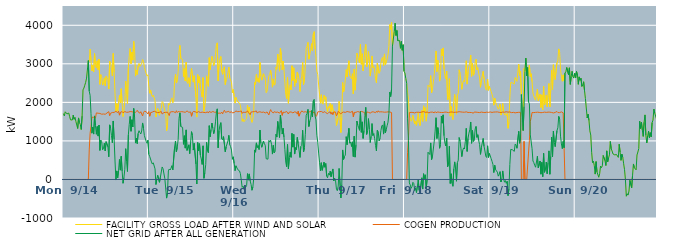
| Category | FACILITY GROSS LOAD AFTER WIND AND SOLAR | COGEN PRODUCTION | NET GRID AFTER ALL GENERATION |
|---|---|---|---|
|  Mon  9/14 | 1708 | 0 | 1708 |
|  Mon  9/14 | 1648 | 0 | 1648 |
|  Mon  9/14 | 1755 | 0 | 1755 |
|  Mon  9/14 | 1758 | 0 | 1758 |
|  Mon  9/14 | 1700 | 0 | 1700 |
|  Mon  9/14 | 1678 | 0 | 1678 |
|  Mon  9/14 | 1722 | 0 | 1722 |
|  Mon  9/14 | 1629 | 0 | 1629 |
|  Mon  9/14 | 1546 | 0 | 1546 |
|  Mon  9/14 | 1526 | 0 | 1526 |
|  Mon  9/14 | 1543 | 0 | 1543 |
|  Mon  9/14 | 1670 | 0 | 1670 |
|  Mon  9/14 | 1560 | 0 | 1560 |
|  Mon  9/14 | 1612 | 0 | 1612 |
|  Mon  9/14 | 1504 | 0 | 1504 |
|  Mon  9/14 | 1506 | 0 | 1506 |
|  Mon  9/14 | 1323 | 0 | 1323 |
|  Mon  9/14 | 1596 | 0 | 1596 |
|  Mon  9/14 | 1475 | 0 | 1475 |
|  Mon  9/14 | 1426 | 0 | 1426 |
|  Mon  9/14 | 1296 | 0 | 1296 |
|  Mon  9/14 | 1643 | 0 | 1643 |
|  Mon  9/14 | 2324 | 0 | 2324 |
|  Mon  9/14 | 2370 | 0 | 2370 |
|  Mon  9/14 | 2444 | 0 | 2444 |
|  Mon  9/14 | 2520 | 0 | 2520 |
|  Mon  9/14 | 2630 | 0 | 2630 |
|  Mon  9/14 | 2622 | 0 | 2622 |
|  Mon  9/14 | 3085 | 0 | 3085 |
|  Mon  9/14 | 3057 | 765 | 2292 |
|  Mon  9/14 | 3379 | 1198 | 2181 |
|  Mon  9/14 | 3082 | 1374 | 1708 |
|  Mon  9/14 | 2815 | 1615 | 1200 |
|  Mon  9/14 | 2960 | 1601 | 1359 |
|  Mon  9/14 | 2789 | 1612 | 1177 |
|  Mon  9/14 | 3266 | 1618 | 1648 |
|  Mon  9/14 | 2987 | 1591 | 1396 |
|  Mon  9/14 | 2899 | 1727 | 1172 |
|  Mon  9/14 | 3079 | 1705 | 1374 |
|  Mon  9/14 | 2843 | 1718 | 1125 |
|  Mon  9/14 | 3125 | 1714 | 1411 |
|  Mon  9/14 | 2467 | 1713 | 754 |
|  Mon  9/14 | 2721 | 1700 | 1021 |
|  Mon  9/14 | 2673 | 1693 | 980 |
|  Mon  9/14 | 2448 | 1678 | 770 |
|  Mon  9/14 | 2494 | 1698 | 796 |
|  Mon  9/14 | 2636 | 1697 | 939 |
|  Mon  9/14 | 2431 | 1692 | 739 |
|  Mon  9/14 | 2679 | 1699 | 980 |
|  Mon  9/14 | 2685 | 1725 | 960 |
|  Mon  9/14 | 2589 | 1742 | 847 |
|  Mon  9/14 | 2347 | 1759 | 588 |
|  Mon  9/14 | 3069 | 1653 | 1416 |
|  Mon  9/14 | 3043 | 1717 | 1326 |
|  Mon  9/14 | 2835 | 1694 | 1141 |
|  Mon  9/14 | 2688 | 1737 | 951 |
|  Mon  9/14 | 3269 | 1752 | 1517 |
|  Mon  9/14 | 2779 | 1740 | 1039 |
|  Mon  9/14 | 2227 | 1749 | 478 |
|  Mon  9/14 | 1752 | 1767 | -15 |
|  Mon  9/14 | 1965 | 1743 | 222 |
|  Mon  9/14 | 1774 | 1735 | 39 |
|  Mon  9/14 | 2002 | 1772 | 230 |
|  Mon  9/14 | 2186 | 1668 | 518 |
|  Mon  9/14 | 1984 | 1742 | 242 |
|  Mon  9/14 | 2354 | 1753 | 601 |
|  Mon  9/14 | 1978 | 1760 | 218 |
|  Mon  9/14 | 1632 | 1731 | -99 |
|  Mon  9/14 | 1783 | 1734 | 49 |
|  Mon  9/14 | 2023 | 1761 | 262 |
|  Mon  9/14 | 2551 | 1753 | 798 |
|  Mon  9/14 | 2209 | 1742 | 467 |
|  Mon  9/14 | 1967 | 1760 | 207 |
|  Mon  9/14 | 2902 | 1746 | 1156 |
|  Mon  9/14 | 3194 | 1766 | 1428 |
|  Mon  9/14 | 3397 | 1762 | 1635 |
|  Mon  9/14 | 3003 | 1753 | 1250 |
|  Mon  9/14 | 3306 | 1757 | 1549 |
|  Mon  9/14 | 3096 | 1734 | 1362 |
|  Mon  9/14 | 3584 | 1742 | 1842 |
|  Mon  9/14 | 3366 | 1763 | 1603 |
|  Mon  9/14 | 2681 | 1738 | 943 |
|  Mon  9/14 | 2839 | 1766 | 1073 |
|  Mon  9/14 | 2723 | 1794 | 929 |
|  Mon  9/14 | 2945 | 1752 | 1193 |
|  Mon  9/14 | 3012 | 1747 | 1265 |
|  Mon  9/14 | 2933 | 1720 | 1213 |
|  Mon  9/14 | 2938 | 1758 | 1180 |
|  Mon  9/14 | 3011 | 1754 | 1257 |
|  Mon  9/14 | 3113 | 1647 | 1466 |
|  Mon  9/14 | 3062 | 1734 | 1328 |
|  Mon  9/14 | 2908 | 1769 | 1139 |
|  Mon  9/14 | 2885 | 1750 | 1135 |
|  Mon  9/14 | 2748 | 1758 | 990 |
|  Mon  9/14 | 2685 | 1745 | 940 |
|  Mon  9/14 | 2718 | 1699 | 1019 |
|  Tue  9/15 | 2416 | 1761 | 655 |
|  Tue  9/15 | 2237 | 1640 | 597 |
|  Tue  9/15 | 2322 | 1731 | 591 |
|  Tue  9/15 | 2206 | 1751 | 455 |
|  Tue  9/15 | 2147 | 1748 | 399 |
|  Tue  9/15 | 2190 | 1758 | 432 |
|  Tue  9/15 | 2185 | 1772 | 413 |
|  Tue  9/15 | 2046 | 1772 | 274 |
|  Tue  9/15 | 1619 | 1750 | -131 |
|  Tue  9/15 | 1743 | 1733 | 10 |
|  Tue  9/15 | 1841 | 1732 | 109 |
|  Tue  9/15 | 1838 | 1717 | 121 |
|  Tue  9/15 | 1668 | 1741 | -73 |
|  Tue  9/15 | 1808 | 1751 | 57 |
|  Tue  9/15 | 1844 | 1764 | 80 |
|  Tue  9/15 | 2022 | 1698 | 324 |
|  Tue  9/15 | 1995 | 1716 | 279 |
|  Tue  9/15 | 2000 | 1735 | 265 |
|  Tue  9/15 | 1773 | 1749 | 24 |
|  Tue  9/15 | 1746 | 1740 | 6 |
|  Tue  9/15 | 1259 | 1743 | -484 |
|  Tue  9/15 | 1400 | 1747 | -347 |
|  Tue  9/15 | 1972 | 1751 | 221 |
|  Tue  9/15 | 1929 | 1657 | 272 |
|  Tue  9/15 | 1994 | 1748 | 246 |
|  Tue  9/15 | 2063 | 1770 | 293 |
|  Tue  9/15 | 2117 | 1758 | 359 |
|  Tue  9/15 | 1987 | 1739 | 248 |
|  Tue  9/15 | 2026 | 1757 | 269 |
|  Tue  9/15 | 2584 | 1746 | 838 |
|  Tue  9/15 | 2729 | 1731 | 998 |
|  Tue  9/15 | 2500 | 1783 | 717 |
|  Tue  9/15 | 2570 | 1735 | 835 |
|  Tue  9/15 | 2799 | 1764 | 1035 |
|  Tue  9/15 | 3325 | 1740 | 1585 |
|  Tue  9/15 | 3477 | 1750 | 1727 |
|  Tue  9/15 | 3135 | 1762 | 1373 |
|  Tue  9/15 | 3140 | 1760 | 1380 |
|  Tue  9/15 | 3111 | 1759 | 1352 |
|  Tue  9/15 | 2662 | 1751 | 911 |
|  Tue  9/15 | 2875 | 1740 | 1135 |
|  Tue  9/15 | 2554 | 1742 | 812 |
|  Tue  9/15 | 3045 | 1759 | 1286 |
|  Tue  9/15 | 2533 | 1779 | 754 |
|  Tue  9/15 | 2489 | 1754 | 735 |
|  Tue  9/15 | 2640 | 1742 | 898 |
|  Tue  9/15 | 2409 | 1738 | 671 |
|  Tue  9/15 | 2715 | 1752 | 963 |
|  Tue  9/15 | 2880 | 1640 | 1240 |
|  Tue  9/15 | 2882 | 1732 | 1150 |
|  Tue  9/15 | 2525 | 1763 | 762 |
|  Tue  9/15 | 2692 | 1755 | 937 |
|  Tue  9/15 | 2690 | 1757 | 933 |
|  Tue  9/15 | 2138 | 1740 | 398 |
|  Tue  9/15 | 1618 | 1736 | -118 |
|  Tue  9/15 | 2720 | 1761 | 959 |
|  Tue  9/15 | 2505 | 1759 | 746 |
|  Tue  9/15 | 2666 | 1738 | 928 |
|  Tue  9/15 | 2363 | 1736 | 627 |
|  Tue  9/15 | 2280 | 1748 | 532 |
|  Tue  9/15 | 2136 | 1747 | 389 |
|  Tue  9/15 | 2642 | 1769 | 873 |
|  Tue  9/15 | 1768 | 1738 | 30 |
|  Tue  9/15 | 1917 | 1741 | 176 |
|  Tue  9/15 | 2116 | 1733 | 383 |
|  Tue  9/15 | 2689 | 1725 | 964 |
|  Tue  9/15 | 2496 | 1754 | 742 |
|  Tue  9/15 | 2415 | 1723 | 692 |
|  Tue  9/15 | 3159 | 1764 | 1395 |
|  Tue  9/15 | 2850 | 1743 | 1107 |
|  Tue  9/15 | 3035 | 1739 | 1296 |
|  Tue  9/15 | 3195 | 1731 | 1464 |
|  Tue  9/15 | 3089 | 1763 | 1326 |
|  Tue  9/15 | 2952 | 1764 | 1188 |
|  Tue  9/15 | 3034 | 1743 | 1291 |
|  Tue  9/15 | 3243 | 1749 | 1494 |
|  Tue  9/15 | 3491 | 1749 | 1742 |
|  Tue  9/15 | 3544 | 1712 | 1832 |
|  Tue  9/15 | 2555 | 1734 | 821 |
|  Tue  9/15 | 2988 | 1722 | 1266 |
|  Tue  9/15 | 3123 | 1717 | 1406 |
|  Tue  9/15 | 3190 | 1716 | 1474 |
|  Tue  9/15 | 2801 | 1746 | 1055 |
|  Tue  9/15 | 2728 | 1700 | 1028 |
|  Tue  9/15 | 2873 | 1761 | 1112 |
|  Tue  9/15 | 2922 | 1796 | 1126 |
|  Tue  9/15 | 2461 | 1743 | 718 |
|  Tue  9/15 | 2598 | 1749 | 849 |
|  Tue  9/15 | 2627 | 1754 | 873 |
|  Tue  9/15 | 2771 | 1772 | 999 |
|  Tue  9/15 | 2913 | 1769 | 1144 |
|  Tue  9/15 | 2640 | 1736 | 904 |
|  Tue  9/15 | 2580 | 1729 | 851 |
|  Tue  9/15 | 2519 | 1757 | 762 |
|  Tue  9/15 | 2249 | 1726 | 523 |
|  Tue  9/15 | 2334 | 1747 | 587 |
|  Wed  9/16 | 2151 | 1738 | 413 |
|  Wed  9/16 | 1980 | 1751 | 229 |
|  Wed  9/16 | 2131 | 1776 | 355 |
|  Wed  9/16 | 2134 | 1778 | 356 |
|  Wed  9/16 | 2014 | 1758 | 256 |
|  Wed  9/16 | 1998 | 1741 | 257 |
|  Wed  9/16 | 1985 | 1763 | 222 |
|  Wed  9/16 | 1920 | 1769 | 151 |
|  Wed  9/16 | 1759 | 1777 | -18 |
|  Wed  9/16 | 1509 | 1714 | -205 |
|  Wed  9/16 | 1572 | 1745 | -173 |
|  Wed  9/16 | 1496 | 1744 | -248 |
|  Wed  9/16 | 1484 | 1741 | -257 |
|  Wed  9/16 | 1556 | 1753 | -197 |
|  Wed  9/16 | 1588 | 1746 | -158 |
|  Wed  9/16 | 1932 | 1781 | 151 |
|  Wed  9/16 | 1721 | 1738 | -17 |
|  Wed  9/16 | 1877 | 1733 | 144 |
|  Wed  9/16 | 1643 | 1680 | -37 |
|  Wed  9/16 | 1618 | 1748 | -130 |
|  Wed  9/16 | 1478 | 1758 | -280 |
|  Wed  9/16 | 1559 | 1756 | -197 |
|  Wed  9/16 | 1772 | 1743 | 29 |
|  Wed  9/16 | 2527 | 1761 | 766 |
|  Wed  9/16 | 2464 | 1757 | 707 |
|  Wed  9/16 | 2726 | 1777 | 949 |
|  Wed  9/16 | 2546 | 1721 | 825 |
|  Wed  9/16 | 2629 | 1748 | 881 |
|  Wed  9/16 | 2519 | 1744 | 775 |
|  Wed  9/16 | 3036 | 1755 | 1281 |
|  Wed  9/16 | 2675 | 1738 | 937 |
|  Wed  9/16 | 2576 | 1741 | 835 |
|  Wed  9/16 | 2559 | 1723 | 836 |
|  Wed  9/16 | 2743 | 1748 | 995 |
|  Wed  9/16 | 2691 | 1754 | 937 |
|  Wed  9/16 | 2600 | 1726 | 874 |
|  Wed  9/16 | 2250 | 1713 | 537 |
|  Wed  9/16 | 2290 | 1752 | 538 |
|  Wed  9/16 | 2266 | 1739 | 527 |
|  Wed  9/16 | 2686 | 1673 | 1013 |
|  Wed  9/16 | 2722 | 1753 | 969 |
|  Wed  9/16 | 2830 | 1812 | 1018 |
|  Wed  9/16 | 2675 | 1761 | 914 |
|  Wed  9/16 | 2394 | 1736 | 658 |
|  Wed  9/16 | 2609 | 1725 | 884 |
|  Wed  9/16 | 2446 | 1758 | 688 |
|  Wed  9/16 | 2472 | 1744 | 728 |
|  Wed  9/16 | 2912 | 1741 | 1171 |
|  Wed  9/16 | 2858 | 1758 | 1100 |
|  Wed  9/16 | 3252 | 1748 | 1504 |
|  Wed  9/16 | 3053 | 1737 | 1316 |
|  Wed  9/16 | 2808 | 1720 | 1088 |
|  Wed  9/16 | 3405 | 1733 | 1672 |
|  Wed  9/16 | 3229 | 1786 | 1443 |
|  Wed  9/16 | 2840 | 1663 | 1177 |
|  Wed  9/16 | 3073 | 1745 | 1328 |
|  Wed  9/16 | 2856 | 1759 | 1097 |
|  Wed  9/16 | 2521 | 1740 | 781 |
|  Wed  9/16 | 2212 | 1760 | 452 |
|  Wed  9/16 | 2095 | 1764 | 331 |
|  Wed  9/16 | 2655 | 1747 | 908 |
|  Wed  9/16 | 1975 | 1698 | 277 |
|  Wed  9/16 | 2313 | 1748 | 565 |
|  Wed  9/16 | 2455 | 1748 | 707 |
|  Wed  9/16 | 2326 | 1752 | 574 |
|  Wed  9/16 | 2950 | 1755 | 1195 |
|  Wed  9/16 | 2566 | 1728 | 838 |
|  Wed  9/16 | 2897 | 1728 | 1169 |
|  Wed  9/16 | 2413 | 1754 | 659 |
|  Wed  9/16 | 2591 | 1764 | 827 |
|  Wed  9/16 | 2514 | 1741 | 773 |
|  Wed  9/16 | 2785 | 1694 | 1091 |
|  Wed  9/16 | 2704 | 1771 | 933 |
|  Wed  9/16 | 2587 | 1642 | 945 |
|  Wed  9/16 | 2282 | 1711 | 571 |
|  Wed  9/16 | 2587 | 1729 | 858 |
|  Wed  9/16 | 2662 | 1778 | 884 |
|  Wed  9/16 | 3037 | 1760 | 1277 |
|  Wed  9/16 | 2459 | 1747 | 712 |
|  Wed  9/16 | 2582 | 1762 | 820 |
|  Wed  9/16 | 2930 | 1757 | 1173 |
|  Wed  9/16 | 3404 | 1738 | 1666 |
|  Wed  9/16 | 3458 | 1745 | 1713 |
|  Wed  9/16 | 3556 | 1738 | 1818 |
|  Wed  9/16 | 3121 | 1747 | 1374 |
|  Wed  9/16 | 3240 | 1727 | 1513 |
|  Wed  9/16 | 3359 | 1768 | 1591 |
|  Wed  9/16 | 3523 | 1737 | 1786 |
|  Wed  9/16 | 3333 | 1708 | 1625 |
|  Wed  9/16 | 3768 | 1729 | 2039 |
|  Wed  9/16 | 3835 | 1755 | 2080 |
|  Wed  9/16 | 3384 | 1739 | 1645 |
|  Wed  9/16 | 3180 | 1634 | 1546 |
|  Wed  9/16 | 2812 | 1665 | 1147 |
|  Wed  9/16 | 2720 | 1753 | 967 |
|  Wed  9/16 | 2449 | 1764 | 685 |
|  Thu  9/17 | 2208 | 1760 | 448 |
|  Thu  9/17 | 1977 | 1750 | 227 |
|  Thu  9/17 | 2198 | 1764 | 434 |
|  Thu  9/17 | 1980 | 1744 | 236 |
|  Thu  9/17 | 1951 | 1737 | 214 |
|  Thu  9/17 | 2183 | 1738 | 445 |
|  Thu  9/17 | 2077 | 1760 | 317 |
|  Thu  9/17 | 2146 | 1733 | 413 |
|  Thu  9/17 | 1840 | 1751 | 89 |
|  Thu  9/17 | 1749 | 1706 | 43 |
|  Thu  9/17 | 1891 | 1732 | 159 |
|  Thu  9/17 | 1850 | 1738 | 112 |
|  Thu  9/17 | 1973 | 1756 | 217 |
|  Thu  9/17 | 1762 | 1693 | 69 |
|  Thu  9/17 | 1939 | 1745 | 194 |
|  Thu  9/17 | 1951 | 1678 | 273 |
|  Thu  9/17 | 1716 | 1753 | -37 |
|  Thu  9/17 | 1769 | 1740 | 29 |
|  Thu  9/17 | 1726 | 1745 | -19 |
|  Thu  9/17 | 1400 | 1651 | -251 |
|  Thu  9/17 | 1397 | 1689 | -292 |
|  Thu  9/17 | 1595 | 1767 | -172 |
|  Thu  9/17 | 2025 | 1740 | 285 |
|  Thu  9/17 | 2013 | 1738 | 275 |
|  Thu  9/17 | 1219 | 1698 | -479 |
|  Thu  9/17 | 1599 | 1732 | -133 |
|  Thu  9/17 | 2516 | 1750 | 766 |
|  Thu  9/17 | 2268 | 1749 | 519 |
|  Thu  9/17 | 2364 | 1774 | 590 |
|  Thu  9/17 | 2374 | 1740 | 634 |
|  Thu  9/17 | 2850 | 1740 | 1110 |
|  Thu  9/17 | 2664 | 1762 | 902 |
|  Thu  9/17 | 2657 | 1743 | 914 |
|  Thu  9/17 | 3078 | 1752 | 1326 |
|  Thu  9/17 | 2695 | 1754 | 941 |
|  Thu  9/17 | 2714 | 1742 | 972 |
|  Thu  9/17 | 2611 | 1755 | 856 |
|  Thu  9/17 | 2744 | 1769 | 975 |
|  Thu  9/17 | 2218 | 1624 | 594 |
|  Thu  9/17 | 2862 | 1740 | 1122 |
|  Thu  9/17 | 2316 | 1737 | 579 |
|  Thu  9/17 | 2643 | 1742 | 901 |
|  Thu  9/17 | 3276 | 1761 | 1515 |
|  Thu  9/17 | 3177 | 1762 | 1415 |
|  Thu  9/17 | 3086 | 1746 | 1340 |
|  Thu  9/17 | 3021 | 1746 | 1275 |
|  Thu  9/17 | 3505 | 1745 | 1760 |
|  Thu  9/17 | 2987 | 1764 | 1223 |
|  Thu  9/17 | 3262 | 1767 | 1495 |
|  Thu  9/17 | 2817 | 1752 | 1065 |
|  Thu  9/17 | 3034 | 1766 | 1268 |
|  Thu  9/17 | 3383 | 1724 | 1659 |
|  Thu  9/17 | 3504 | 1634 | 1870 |
|  Thu  9/17 | 2921 | 1752 | 1169 |
|  Thu  9/17 | 3041 | 1774 | 1267 |
|  Thu  9/17 | 3319 | 1741 | 1578 |
|  Thu  9/17 | 3057 | 1760 | 1297 |
|  Thu  9/17 | 2681 | 1722 | 959 |
|  Thu  9/17 | 2865 | 1745 | 1120 |
|  Thu  9/17 | 3204 | 1754 | 1450 |
|  Thu  9/17 | 2898 | 1758 | 1140 |
|  Thu  9/17 | 2939 | 1751 | 1188 |
|  Thu  9/17 | 2815 | 1758 | 1057 |
|  Thu  9/17 | 2609 | 1731 | 878 |
|  Thu  9/17 | 2508 | 1770 | 738 |
|  Thu  9/17 | 3018 | 1740 | 1278 |
|  Thu  9/17 | 3024 | 1782 | 1242 |
|  Thu  9/17 | 2753 | 1750 | 1003 |
|  Thu  9/17 | 2808 | 1744 | 1064 |
|  Thu  9/17 | 3023 | 1755 | 1268 |
|  Thu  9/17 | 3131 | 1742 | 1389 |
|  Thu  9/17 | 3167 | 1752 | 1415 |
|  Thu  9/17 | 2950 | 1773 | 1177 |
|  Thu  9/17 | 3257 | 1745 | 1512 |
|  Thu  9/17 | 2977 | 1766 | 1211 |
|  Thu  9/17 | 3042 | 1747 | 1295 |
|  Thu  9/17 | 3123 | 1729 | 1394 |
|  Thu  9/17 | 3240 | 1754 | 1486 |
|  Thu  9/17 | 3454 | 1746 | 1708 |
|  Thu  9/17 | 4017 | 1751 | 2266 |
|  Thu  9/17 | 3896 | 1744 | 2152 |
|  Thu  9/17 | 4078 | 1736 | 2342 |
|  Thu  9/17 | 3459 | 0 | 3459 |
|  Thu  9/17 | 3436 | 0 | 3436 |
|  Thu  9/17 | 3834 | 0 | 3834 |
|  Thu  9/17 | 4052 | 0 | 4052 |
|  Thu  9/17 | 3735 | 0 | 3735 |
|  Thu  9/17 | 3864 | 0 | 3864 |
|  Thu  9/17 | 3598 | 0 | 3598 |
|  Thu  9/17 | 3588 | 0 | 3588 |
|  Thu  9/17 | 3604 | 0 | 3604 |
|  Thu  9/17 | 3403 | 0 | 3403 |
|  Thu  9/17 | 3580 | 0 | 3580 |
|  Thu  9/17 | 3351 | 0 | 3351 |
|  Thu  9/17 | 3495 | 0 | 3495 |
|  Thu  9/17 | 2809 | 0 | 2809 |
|  Fri  9/18 | 2762 | 0 | 2762 |
|  Fri  9/18 | 2622 | 0 | 2622 |
|  Fri  9/18 | 2495 | 0 | 2495 |
|  Fri  9/18 | 2263 | 692 | 1571 |
|  Fri  9/18 | 2076 | 1064 | 1012 |
|  Fri  9/18 | 1644 | 1734 | -90 |
|  Fri  9/18 | 1596 | 1739 | -143 |
|  Fri  9/18 | 1510 | 1741 | -231 |
|  Fri  9/18 | 1562 | 1747 | -185 |
|  Fri  9/18 | 1664 | 1738 | -74 |
|  Fri  9/18 | 1639 | 1745 | -106 |
|  Fri  9/18 | 1438 | 1726 | -288 |
|  Fri  9/18 | 1515 | 1739 | -224 |
|  Fri  9/18 | 1403 | 1743 | -340 |
|  Fri  9/18 | 1563 | 1740 | -177 |
|  Fri  9/18 | 1733 | 1744 | -11 |
|  Fri  9/18 | 1474 | 1752 | -278 |
|  Fri  9/18 | 1398 | 1739 | -341 |
|  Fri  9/18 | 1404 | 1736 | -332 |
|  Fri  9/18 | 1791 | 1749 | 42 |
|  Fri  9/18 | 1507 | 1756 | -249 |
|  Fri  9/18 | 1910 | 1761 | 149 |
|  Fri  9/18 | 1770 | 1747 | 23 |
|  Fri  9/18 | 1861 | 1741 | 120 |
|  Fri  9/18 | 1512 | 1740 | -228 |
|  Fri  9/18 | 1751 | 1749 | 2 |
|  Fri  9/18 | 2446 | 1740 | 706 |
|  Fri  9/18 | 2436 | 1727 | 709 |
|  Fri  9/18 | 2394 | 1746 | 648 |
|  Fri  9/18 | 2694 | 1746 | 948 |
|  Fri  9/18 | 2250 | 1735 | 515 |
|  Fri  9/18 | 2351 | 1747 | 604 |
|  Fri  9/18 | 2344 | 1742 | 602 |
|  Fri  9/18 | 2724 | 1729 | 995 |
|  Fri  9/18 | 3015 | 1760 | 1255 |
|  Fri  9/18 | 3334 | 1732 | 1602 |
|  Fri  9/18 | 2797 | 1734 | 1063 |
|  Fri  9/18 | 3096 | 1751 | 1345 |
|  Fri  9/18 | 2910 | 1728 | 1182 |
|  Fri  9/18 | 2550 | 1741 | 809 |
|  Fri  9/18 | 2653 | 1748 | 905 |
|  Fri  9/18 | 3382 | 1738 | 1644 |
|  Fri  9/18 | 3207 | 1747 | 1460 |
|  Fri  9/18 | 3412 | 1736 | 1676 |
|  Fri  9/18 | 2870 | 1736 | 1134 |
|  Fri  9/18 | 2692 | 1748 | 944 |
|  Fri  9/18 | 2609 | 1741 | 868 |
|  Fri  9/18 | 2813 | 1744 | 1069 |
|  Fri  9/18 | 2061 | 1733 | 328 |
|  Fri  9/18 | 2127 | 1734 | 393 |
|  Fri  9/18 | 2615 | 1753 | 862 |
|  Fri  9/18 | 1643 | 1747 | -104 |
|  Fri  9/18 | 1893 | 1745 | 148 |
|  Fri  9/18 | 1652 | 1751 | -99 |
|  Fri  9/18 | 1554 | 1731 | -177 |
|  Fri  9/18 | 2016 | 1740 | 276 |
|  Fri  9/18 | 2206 | 1750 | 456 |
|  Fri  9/18 | 1999 | 1744 | 255 |
|  Fri  9/18 | 1692 | 1738 | -46 |
|  Fri  9/18 | 2181 | 1747 | 434 |
|  Fri  9/18 | 2239 | 1739 | 500 |
|  Fri  9/18 | 2845 | 1758 | 1087 |
|  Fri  9/18 | 2753 | 1757 | 996 |
|  Fri  9/18 | 2560 | 1751 | 809 |
|  Fri  9/18 | 2339 | 1746 | 593 |
|  Fri  9/18 | 2500 | 1746 | 754 |
|  Fri  9/18 | 2563 | 1744 | 819 |
|  Fri  9/18 | 2534 | 1744 | 790 |
|  Fri  9/18 | 2732 | 1740 | 992 |
|  Fri  9/18 | 3080 | 1754 | 1326 |
|  Fri  9/18 | 2474 | 1746 | 728 |
|  Fri  9/18 | 2801 | 1738 | 1063 |
|  Fri  9/18 | 2938 | 1736 | 1202 |
|  Fri  9/18 | 3027 | 1739 | 1288 |
|  Fri  9/18 | 3229 | 1738 | 1491 |
|  Fri  9/18 | 2675 | 1737 | 938 |
|  Fri  9/18 | 3016 | 1746 | 1270 |
|  Fri  9/18 | 2704 | 1719 | 985 |
|  Fri  9/18 | 2761 | 1750 | 1011 |
|  Fri  9/18 | 3048 | 1737 | 1311 |
|  Fri  9/18 | 3121 | 1746 | 1375 |
|  Fri  9/18 | 2846 | 1753 | 1093 |
|  Fri  9/18 | 2901 | 1741 | 1160 |
|  Fri  9/18 | 2751 | 1742 | 1009 |
|  Fri  9/18 | 2639 | 1736 | 903 |
|  Fri  9/18 | 2391 | 1740 | 651 |
|  Fri  9/18 | 2580 | 1747 | 833 |
|  Fri  9/18 | 2564 | 1736 | 828 |
|  Fri  9/18 | 2804 | 1740 | 1064 |
|  Fri  9/18 | 2606 | 1748 | 858 |
|  Fri  9/18 | 2472 | 1735 | 737 |
|  Fri  9/18 | 2347 | 1746 | 601 |
|  Fri  9/18 | 2315 | 1746 | 569 |
|  Fri  9/18 | 2606 | 1733 | 873 |
|  Fri  9/18 | 2312 | 1740 | 572 |
|  Fri  9/18 | 2416 | 1740 | 676 |
|  Sat  9/19 | 2408 | 1751 | 657 |
|  Sat  9/19 | 2281 | 1741 | 540 |
|  Sat  9/19 | 2208 | 1739 | 469 |
|  Sat  9/19 | 2123 | 1733 | 390 |
|  Sat  9/19 | 1927 | 1748 | 179 |
|  Sat  9/19 | 2108 | 1739 | 369 |
|  Sat  9/19 | 2005 | 1750 | 255 |
|  Sat  9/19 | 1945 | 1725 | 220 |
|  Sat  9/19 | 1942 | 1752 | 190 |
|  Sat  9/19 | 1822 | 1737 | 85 |
|  Sat  9/19 | 1877 | 1742 | 135 |
|  Sat  9/19 | 1951 | 1748 | 203 |
|  Sat  9/19 | 1670 | 1735 | -65 |
|  Sat  9/19 | 1741 | 1742 | -1 |
|  Sat  9/19 | 1969 | 1748 | 221 |
|  Sat  9/19 | 1764 | 1747 | 17 |
|  Sat  9/19 | 1673 | 1744 | -71 |
|  Sat  9/19 | 1707 | 1736 | -29 |
|  Sat  9/19 | 1655 | 1756 | -101 |
|  Sat  9/19 | 1710 | 1757 | -47 |
|  Sat  9/19 | 1328 | 1747 | -419 |
|  Sat  9/19 | 1482 | 1729 | -247 |
|  Sat  9/19 | 2137 | 1750 | 387 |
|  Sat  9/19 | 2516 | 1737 | 779 |
|  Sat  9/19 | 2496 | 1733 | 763 |
|  Sat  9/19 | 2505 | 1737 | 768 |
|  Sat  9/19 | 2508 | 1741 | 767 |
|  Sat  9/19 | 2475 | 1747 | 728 |
|  Sat  9/19 | 2644 | 1728 | 916 |
|  Sat  9/19 | 2619 | 1732 | 887 |
|  Sat  9/19 | 2546 | 1737 | 809 |
|  Sat  9/19 | 2563 | 1749 | 814 |
|  Sat  9/19 | 2989 | 1742 | 1247 |
|  Sat  9/19 | 2694 | 1755 | 939 |
|  Sat  9/19 | 2813 | 1741 | 1072 |
|  Sat  9/19 | 2202 | 0 | 2202 |
|  Sat  9/19 | 2202 | 0 | 2202 |
|  Sat  9/19 | 1270 | 0 | 1270 |
|  Sat  9/19 | 2879 | 988 | 1891 |
|  Sat  9/19 | 2803 | 0 | 2803 |
|  Sat  9/19 | 3148 | 0 | 3148 |
|  Sat  9/19 | 2686 | 0 | 2686 |
|  Sat  9/19 | 2904 | 0 | 2904 |
|  Sat  9/19 | 2697 | 684 | 2013 |
|  Sat  9/19 | 2969 | 1006 | 1963 |
|  Sat  9/19 | 2658 | 1503 | 1155 |
|  Sat  9/19 | 2741 | 1603 | 1138 |
|  Sat  9/19 | 2536 | 1738 | 798 |
|  Sat  9/19 | 2240 | 1761 | 479 |
|  Sat  9/19 | 2169 | 1734 | 435 |
|  Sat  9/19 | 2106 | 1740 | 366 |
|  Sat  9/19 | 2057 | 1740 | 317 |
|  Sat  9/19 | 2080 | 1739 | 341 |
|  Sat  9/19 | 2347 | 1745 | 602 |
|  Sat  9/19 | 2042 | 1741 | 301 |
|  Sat  9/19 | 2017 | 1740 | 277 |
|  Sat  9/19 | 2208 | 1729 | 479 |
|  Sat  9/19 | 1868 | 1732 | 136 |
|  Sat  9/19 | 2195 | 1751 | 444 |
|  Sat  9/19 | 1810 | 1737 | 73 |
|  Sat  9/19 | 2417 | 1740 | 677 |
|  Sat  9/19 | 1932 | 1747 | 185 |
|  Sat  9/19 | 2019 | 1750 | 269 |
|  Sat  9/19 | 2192 | 1740 | 452 |
|  Sat  9/19 | 1888 | 1739 | 149 |
|  Sat  9/19 | 2184 | 1746 | 438 |
|  Sat  9/19 | 2489 | 1747 | 742 |
|  Sat  9/19 | 1881 | 1746 | 135 |
|  Sat  9/19 | 2343 | 1741 | 602 |
|  Sat  9/19 | 2835 | 1738 | 1097 |
|  Sat  9/19 | 2336 | 1752 | 584 |
|  Sat  9/19 | 2977 | 1725 | 1252 |
|  Sat  9/19 | 2700 | 1736 | 964 |
|  Sat  9/19 | 2590 | 1739 | 851 |
|  Sat  9/19 | 2596 | 1736 | 860 |
|  Sat  9/19 | 3030 | 1763 | 1267 |
|  Sat  9/19 | 3075 | 1736 | 1339 |
|  Sat  9/19 | 3387 | 1751 | 1636 |
|  Sat  9/19 | 3296 | 1734 | 1562 |
|  Sat  9/19 | 2857 | 1733 | 1124 |
|  Sat  9/19 | 2674 | 1753 | 921 |
|  Sat  9/19 | 2547 | 1747 | 800 |
|  Sat  9/19 | 2713 | 1728 | 985 |
|  Sat  9/19 | 2555 | 1731 | 824 |
|  Sat  9/19 | 2759 | 0 | 2759 |
|  Sat  9/19 | 2793 | 0 | 2793 |
|  Sat  9/19 | 2904 | 0 | 2904 |
|  Sat  9/19 | 2880 | 0 | 2880 |
|  Sat  9/19 | 2720 | 0 | 2720 |
|  Sat  9/19 | 2896 | 0 | 2896 |
|  Sat  9/19 | 2467 | 0 | 2467 |
|  Sat  9/19 | 2671 | 0 | 2671 |
|  Sat  9/19 | 2805 | 0 | 2805 |
|  Sun  9/20 | 2669 | 0 | 2669 |
|  Sun  9/20 | 2630 | 0 | 2630 |
|  Sun  9/20 | 2757 | 0 | 2757 |
|  Sun  9/20 | 2635 | 0 | 2635 |
|  Sun  9/20 | 2801 | 0 | 2801 |
|  Sun  9/20 | 2710 | 0 | 2710 |
|  Sun  9/20 | 2468 | 0 | 2468 |
|  Sun  9/20 | 2661 | 0 | 2661 |
|  Sun  9/20 | 2573 | 0 | 2573 |
|  Sun  9/20 | 2627 | 0 | 2627 |
|  Sun  9/20 | 2413 | 0 | 2413 |
|  Sun  9/20 | 2450 | 0 | 2450 |
|  Sun  9/20 | 2535 | 0 | 2535 |
|  Sun  9/20 | 2304 | 0 | 2304 |
|  Sun  9/20 | 2098 | 0 | 2098 |
|  Sun  9/20 | 2116 | 0 | 2116 |
|  Sun  9/20 | 1595 | 0 | 1595 |
|  Sun  9/20 | 1692 | 0 | 1692 |
|  Sun  9/20 | 1530 | 0 | 1530 |
|  Sun  9/20 | 1260 | 0 | 1260 |
|  Sun  9/20 | 1151 | 0 | 1151 |
|  Sun  9/20 | 705 | 0 | 705 |
|  Sun  9/20 | 436 | 0 | 436 |
|  Sun  9/20 | 474 | 0 | 474 |
|  Sun  9/20 | 356 | 0 | 356 |
|  Sun  9/20 | 139 | 0 | 139 |
|  Sun  9/20 | 463 | 0 | 463 |
|  Sun  9/20 | 196 | 0 | 196 |
|  Sun  9/20 | 189 | 0 | 189 |
|  Sun  9/20 | 57 | 0 | 57 |
|  Sun  9/20 | 146 | 0 | 146 |
|  Sun  9/20 | 349 | 0 | 349 |
|  Sun  9/20 | 305 | 0 | 305 |
|  Sun  9/20 | 352 | 0 | 352 |
|  Sun  9/20 | 622 | 0 | 622 |
|  Sun  9/20 | 606 | 0 | 606 |
|  Sun  9/20 | 488 | 0 | 488 |
|  Sun  9/20 | 362 | 0 | 362 |
|  Sun  9/20 | 742 | 0 | 742 |
|  Sun  9/20 | 456 | 0 | 456 |
|  Sun  9/20 | 556 | 0 | 556 |
|  Sun  9/20 | 637 | 0 | 637 |
|  Sun  9/20 | 983 | 0 | 983 |
|  Sun  9/20 | 795 | 0 | 795 |
|  Sun  9/20 | 737 | 0 | 737 |
|  Sun  9/20 | 662 | 0 | 662 |
|  Sun  9/20 | 638 | 0 | 638 |
|  Sun  9/20 | 638 | 0 | 638 |
|  Sun  9/20 | 626 | 0 | 626 |
|  Sun  9/20 | 647 | 0 | 647 |
|  Sun  9/20 | 668 | 0 | 668 |
|  Sun  9/20 | 572 | 0 | 572 |
|  Sun  9/20 | 913 | 0 | 913 |
|  Sun  9/20 | 709 | 0 | 709 |
|  Sun  9/20 | 496 | 0 | 496 |
|  Sun  9/20 | 656 | 0 | 656 |
|  Sun  9/20 | 574 | 0 | 574 |
|  Sun  9/20 | 407 | 0 | 407 |
|  Sun  9/20 | 253 | 0 | 253 |
|  Sun  9/20 | -5 | 0 | -5 |
|  Sun  9/20 | -434 | 0 | -434 |
|  Sun  9/20 | -373 | 0 | -373 |
|  Sun  9/20 | -405 | 0 | -405 |
|  Sun  9/20 | -300 | 0 | -300 |
|  Sun  9/20 | -22 | 0 | -22 |
|  Sun  9/20 | 2 | 0 | 2 |
|  Sun  9/20 | -214 | 0 | -214 |
|  Sun  9/20 | 103 | 0 | 103 |
|  Sun  9/20 | 402 | 0 | 402 |
|  Sun  9/20 | 304 | 0 | 304 |
|  Sun  9/20 | 283 | 0 | 283 |
|  Sun  9/20 | 249 | 0 | 249 |
|  Sun  9/20 | 635 | 0 | 635 |
|  Sun  9/20 | 712 | 0 | 712 |
|  Sun  9/20 | 802 | 0 | 802 |
|  Sun  9/20 | 1510 | 0 | 1510 |
|  Sun  9/20 | 1322 | 0 | 1322 |
|  Sun  9/20 | 1488 | 0 | 1488 |
|  Sun  9/20 | 1285 | 0 | 1285 |
|  Sun  9/20 | 1117 | 0 | 1117 |
|  Sun  9/20 | 1484 | 0 | 1484 |
|  Sun  9/20 | 1675 | 0 | 1675 |
|  Sun  9/20 | 1146 | 0 | 1146 |
|  Sun  9/20 | 946 | 0 | 946 |
|  Sun  9/20 | 1126 | 0 | 1126 |
|  Sun  9/20 | 1252 | 0 | 1252 |
|  Sun  9/20 | 1081 | 0 | 1081 |
|  Sun  9/20 | 1214 | 0 | 1214 |
|  Sun  9/20 | 1107 | 0 | 1107 |
|  Sun  9/20 | 1473 | 0 | 1473 |
|  Sun  9/20 | 1540 | 0 | 1540 |
|  Sun  9/20 | 1825 | 0 | 1825 |
|  Sun  9/20 | 1717 | 0 | 1717 |
|  Sun  9/20 | 1703 | 0 | 1703 |
|  Sun  9/20 | 1564 | 0 | 1564 |